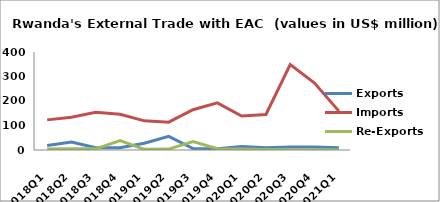
| Category | Exports | Imports | Re-Exports |
|---|---|---|---|
| 2018Q1 | 18.608 | 122.951 | 4.57 |
| 2018Q2 | 32.909 | 133.823 | 4.622 |
| 2018Q3 | 9.064 | 153.831 | 4.747 |
| 2018Q4 | 8.931 | 145.657 | 38.097 |
| 2019Q1 | 27.532 | 118.895 | 2.571 |
| 2019Q2 | 55.968 | 113.561 | 3.654 |
| 2019Q3 | 6.192 | 164.3 | 34.329 |
| 2019Q4 | 5.149 | 192.569 | 5.268 |
| 2020Q1 | 14.209 | 138.663 | 3.748 |
| 2020Q2 | 8.786 | 144.885 | 1.712 |
| 2020Q3 | 11.767 | 348.723 | 1.141 |
| 2020Q4 | 12.136 | 273.335 | 0.92 |
| 2021Q1 | 9.302 | 158.626 | 0.693 |